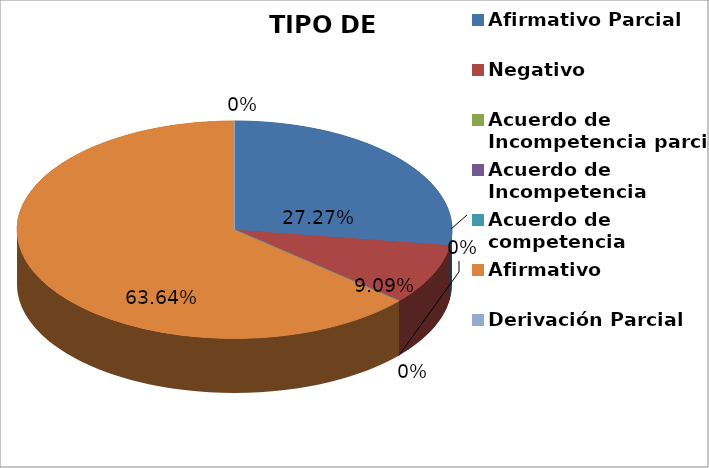
| Category | Series 0 |
|---|---|
| Afirmativo Parcial | 3 |
| Negativo | 1 |
| Acuerdo de Incompetencia parcial | 0 |
| Acuerdo de Incompetencia | 0 |
| Acuerdo de competencia | 0 |
| Afirmativo | 7 |
| Derivación Parcial | 0 |